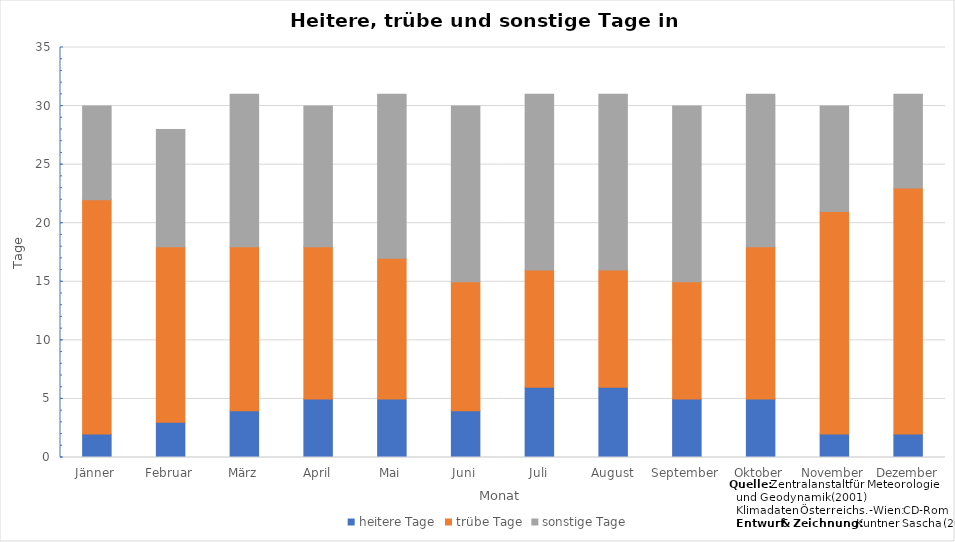
| Category | heitere Tage | trübe Tage | sonstige Tage |
|---|---|---|---|
| Jänner | 2 | 20 | 8 |
| Februar | 3 | 15 | 10 |
| März | 4 | 14 | 13 |
| April | 5 | 13 | 12 |
| Mai | 5 | 12 | 14 |
| Juni | 4 | 11 | 15 |
| Juli | 6 | 10 | 15 |
| August | 6 | 10 | 15 |
| September | 5 | 10 | 15 |
| Oktober | 5 | 13 | 13 |
| November | 2 | 19 | 9 |
| Dezember | 2 | 21 | 8 |